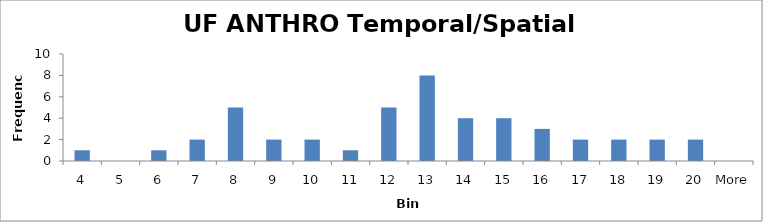
| Category | Frequency |
|---|---|
| 4 | 1 |
| 5 | 0 |
| 6 | 1 |
| 7 | 2 |
| 8 | 5 |
| 9 | 2 |
| 10 | 2 |
| 11 | 1 |
| 12 | 5 |
| 13 | 8 |
| 14 | 4 |
| 15 | 4 |
| 16 | 3 |
| 17 | 2 |
| 18 | 2 |
| 19 | 2 |
| 20 | 2 |
| More | 0 |